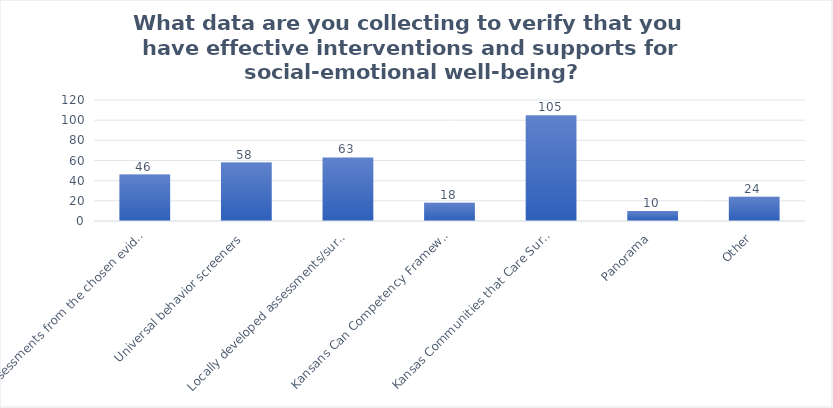
| Category | Count |
|---|---|
| Assessments from the chosen evidence-based SEL curriculum | 46 |
| Universal behavior screeners | 58 |
| Locally developed assessments/surveys | 63 |
| Kansans Can Competency Framework assessments | 18 |
| Kansas Communities that Care Survey (KCTC) | 105 |
| Panorama | 10 |
| Other | 24 |